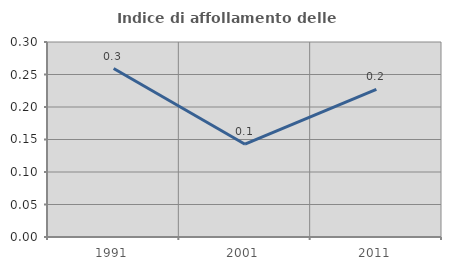
| Category | Indice di affollamento delle abitazioni  |
|---|---|
| 1991.0 | 0.259 |
| 2001.0 | 0.143 |
| 2011.0 | 0.227 |